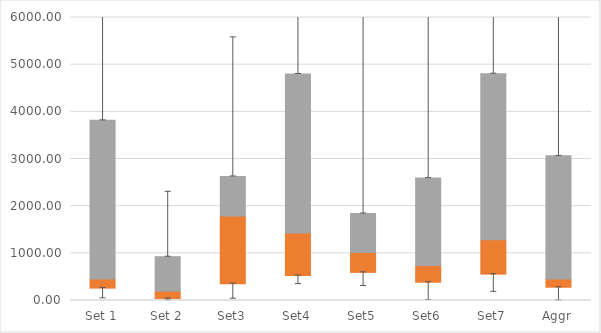
| Category | Q1 | Median-Q1 | Q3-Median |
|---|---|---|---|
| Set 1 | 262.42 | 191.104 | 3366.661 |
| Set 2 | 42.812 | 155.188 | 730.897 |
| Set3 | 356.171 | 1433.594 | 841.4 |
| Set4 | 528.19 | 901.787 | 3373.967 |
| Set5 | 596.78 | 419.338 | 828.908 |
| Set6 | 386.782 | 355.169 | 1852.605 |
| Set7 | 558.252 | 732.114 | 3518.803 |
| Aggr | 280.866 | 172.657 | 2613.06 |